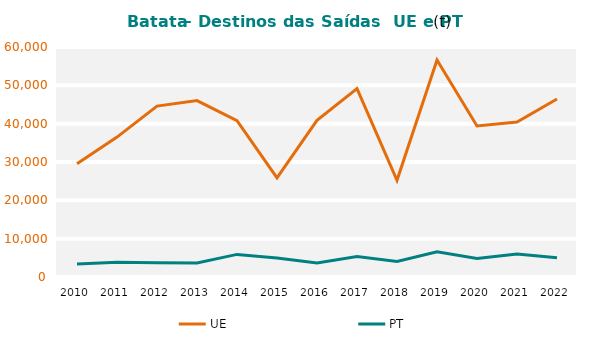
| Category | UE | PT |
|---|---|---|
| 2010.0 | 29549.808 | 3397.927 |
| 2011.0 | 36503.001 | 3835.189 |
| 2012.0 | 44590.615 | 3713.674 |
| 2013.0 | 46025.333 | 3682.478 |
| 2014.0 | 40797.348 | 5897.564 |
| 2015.0 | 25863.286 | 4960.412 |
| 2016.0 | 40863.92 | 3686.89 |
| 2017.0 | 49123.106 | 5317.81 |
| 2018.0 | 25244.803 | 4070.298 |
| 2019.0 | 56602.54 | 6554.75 |
| 2020.0 | 39388.441 | 4856.473 |
| 2021.0 | 40427.967 | 5988.586 |
| 2022.0 | 46417.996 | 5043.418 |